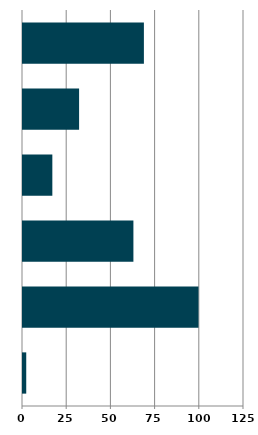
| Category | Series 0 |
|---|---|
| 0 | 1.834 |
| 1 | 99.258 |
| 2 | 62.449 |
| 3 | 16.596 |
| 4 | 31.728 |
| 5 | 68.381 |